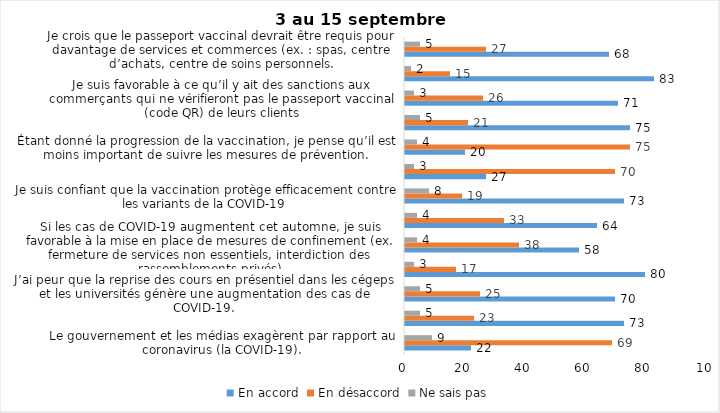
| Category | En accord | En désaccord | Ne sais pas |
|---|---|---|---|
| Le gouvernement et les médias exagèrent par rapport au coronavirus (la COVID-19). | 22 | 69 | 9 |
| J’ai peur que le système de santé soit débordé par les cas de COVID-19 suite au "déconfinement" | 73 | 23 | 5 |
| J’ai peur que la reprise des cours en présentiel dans les cégeps et les universités génère une augmentation des cas de COVID-19. | 70 | 25 | 5 |
| Je suis favorable au passeport vaccinal qui permettrait l'accès à certains lieux ou activités aux personnes vaccinées. | 80 | 17 | 3 |
| Si les cas de COVID-19 augmentent cet automne, je suis favorable à la mise en place de mesures de confinement (ex. fermeture de services non essentiels, interdiction des rassemblements privés) | 58 | 38 | 4 |
| Je suis inquiet de contracter le variant Delta de la Covid-19 | 64 | 33 | 4 |
| Je suis confiant que la vaccination protège efficacement contre les variants de la COVID-19 | 73 | 19 | 8 |
| Je suis favorable à ce que le port du masque ne soit plus obligatoire au Québec. | 27 | 70 | 3 |
| Étant donné la progression de la vaccination, je pense qu’il est moins important de suivre les mesures de prévention. | 20 | 75 | 4 |
| J'ai peur que la reprise des cours en présentiel dans les écoles primaires et secondaires génère une augmentation des cas de COVID-19 | 75 | 21 | 5 |
| Je suis favorable à ce qu’il y ait des sanctions aux commerçants qui ne vérifieront pas le passeport vaccinal (code QR) de leurs clients | 71 | 26 | 3 |
| Je suis favorable à ce qu’il y ait des sanctions aux gens qui tenteront de frauder leur passeport vaccinal par des amendes ou des accusations criminelles. | 83 | 15 | 2 |
| Je crois que le passeport vaccinal devrait être requis pour davantage de services et commerces (ex. : spas, centre d’achats, centre de soins personnels. | 68 | 27 | 5 |